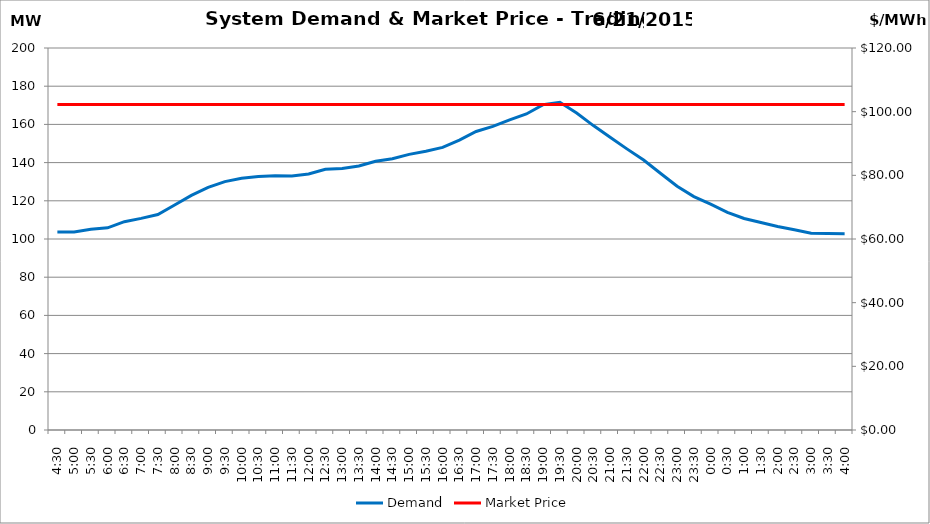
| Category | Demand |
|---|---|
| 0.1875 | 103.71 |
| 0.20833333333333334 | 103.7 |
| 0.22916666666666666 | 105.05 |
| 0.25 | 105.85 |
| 0.270833333333333 | 109.08 |
| 0.291666666666667 | 110.81 |
| 0.3125 | 112.83 |
| 0.333333333333333 | 117.81 |
| 0.354166666666667 | 122.86 |
| 0.375 | 127 |
| 0.395833333333333 | 130.04 |
| 0.416666666666667 | 131.8 |
| 0.4375 | 132.7 |
| 0.458333333333333 | 133.17 |
| 0.479166666666667 | 133.02 |
| 0.5 | 134 |
| 0.520833333333333 | 136.51 |
| 0.541666666666667 | 136.92 |
| 0.5625 | 138.2 |
| 0.583333333333333 | 140.69 |
| 0.604166666666667 | 142.04 |
| 0.625 | 144.3 |
| 0.645833333333334 | 145.99 |
| 0.666666666666667 | 147.99 |
| 0.6875 | 151.79 |
| 0.708333333333334 | 156.3 |
| 0.729166666666667 | 158.93 |
| 0.75 | 162.35 |
| 0.770833333333334 | 165.47 |
| 0.791666666666667 | 170.38 |
| 0.8125 | 171.57 |
| 0.833333333333334 | 165.97 |
| 0.854166666666667 | 159.37 |
| 0.875 | 153.27 |
| 0.895833333333334 | 147.18 |
| 0.916666666666667 | 141.32 |
| 0.9375 | 134.42 |
| 0.958333333333334 | 127.62 |
| 0.979166666666667 | 122.22 |
| 1900-01-01 | 118.22 |
| 1900-01-01 00:30:00 | 113.98 |
| 1900-01-01 01:00:00 | 110.74 |
| 1900-01-01 01:30:00 | 108.6 |
| 1900-01-01 02:00:00 | 106.56 |
| 1900-01-01 02:30:00 | 104.83 |
| 1900-01-01 03:00:00 | 103.03 |
| 1900-01-01 03:30:00 | 102.82 |
| 1900-01-01 04:00:00 | 102.78 |